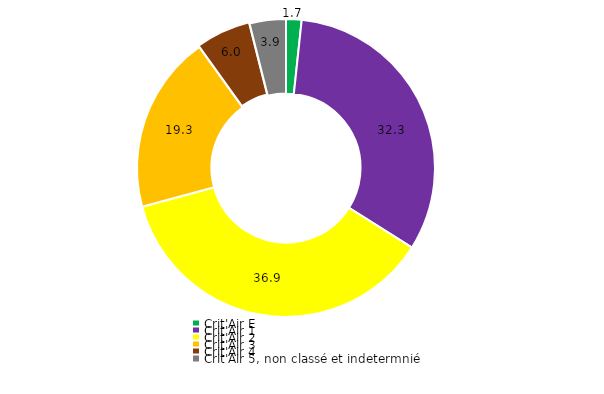
| Category | Series 0 |
|---|---|
| Crit'Air E | 1.683 |
| Crit'Air 1 | 32.278 |
| Crit'Air 2 | 36.861 |
| Crit'Air 3 | 19.272 |
| Crit'Air 4 | 5.972 |
| Crit'Air 5, non classé et indetermnié | 3.934 |